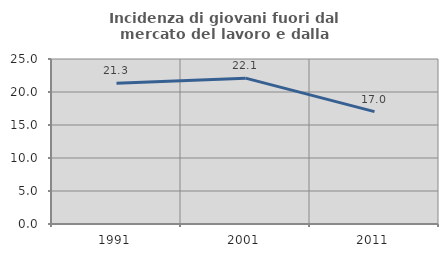
| Category | Incidenza di giovani fuori dal mercato del lavoro e dalla formazione  |
|---|---|
| 1991.0 | 21.311 |
| 2001.0 | 22.099 |
| 2011.0 | 17.033 |